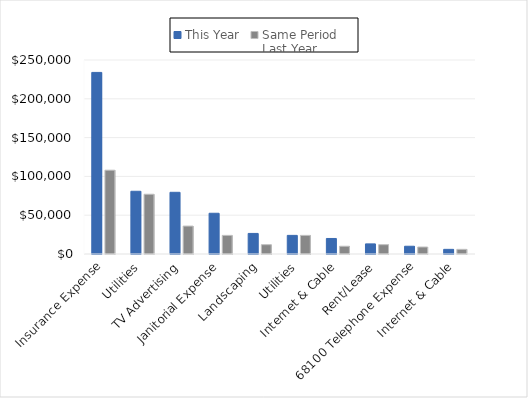
| Category | This Year | Same Period 
Last Year |
|---|---|---|
|  Insurance Expense | 234000 | 108000 |
|  Utilities | 80829.65 | 77000 |
|  TV Advertising | 79500 | 36000 |
|  Janitorial Expense | 52500 | 24000 |
|  Landscaping | 26500 | 12000 |
|  Utilities | 24000 | 24000 |
|  Internet & Cable | 20000 | 10000 |
|  Rent/Lease | 13020 | 12000 |
|  68100 Telephone Expense | 10000 | 9000 |
|  Internet & Cable | 6000 | 6000 |